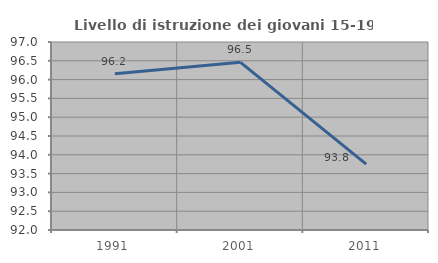
| Category | Livello di istruzione dei giovani 15-19 anni |
|---|---|
| 1991.0 | 96.154 |
| 2001.0 | 96.46 |
| 2011.0 | 93.75 |